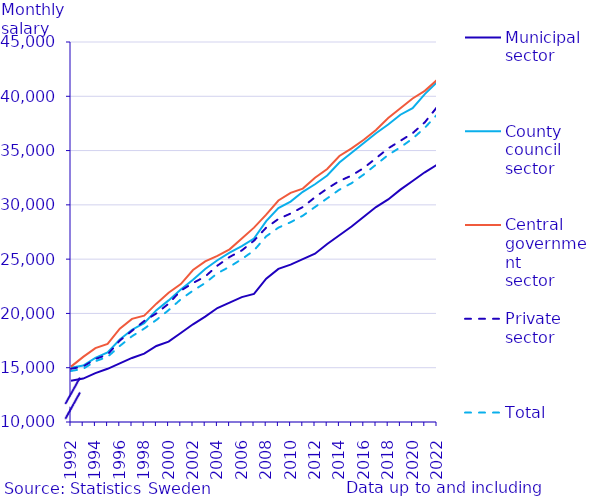
| Category | Municipal
sector | County
council
sector | Central
government
sector | Private
sector | Total |
|---|---|---|---|---|---|
| 1992.0 | 13800 | 15000 | 15100 | 14900 | 14700 |
| 1993.0 | 14000 | 15200 | 16000 | 15100 | 14900 |
| 1994.0 | 14500 | 15900 | 16800 | 15800 | 15600 |
| 1995.0 | 14900 | 16400 | 17200 | 16200 | 16000 |
| 1996.0 | 15400 | 17600 | 18600 | 17500 | 17000 |
| 1997.0 | 15900 | 18500 | 19500 | 18400 | 17900 |
| 1998.0 | 16300 | 19100 | 19800 | 19300 | 18600 |
| 1999.0 | 17000 | 20300 | 20900 | 20000 | 19400 |
| 2000.0 | 17400 | 21200 | 21900 | 20900 | 20300 |
| 2001.0 | 18200 | 22200 | 22700 | 22100 | 21300 |
| 2002.0 | 19000 | 23100 | 24000 | 22800 | 22100 |
| 2003.0 | 19700 | 24100 | 24800 | 23400 | 22800 |
| 2004.0 | 20500 | 24900 | 25300 | 24400 | 23700 |
| 2005.0 | 21000 | 25600 | 25900 | 25200 | 24300 |
| 2006.0 | 21500 | 26200 | 26900 | 25800 | 25000 |
| 2007.0 | 21800 | 26900 | 27900 | 26700 | 25800 |
| 2008.0 | 23200 | 28500 | 29100 | 27900 | 27100 |
| 2009.0 | 24100 | 29700 | 30400 | 28700 | 27900 |
| 2010.0 | 24500 | 30300 | 31100 | 29200 | 28400 |
| 2011.0 | 25000 | 31200 | 31500 | 29800 | 29000 |
| 2012.0 | 25500 | 31900 | 32500 | 30700 | 29800 |
| 2013.0 | 26400 | 32700 | 33300 | 31500 | 30600 |
| 2014.0 | 27200 | 33900 | 34500 | 32200 | 31400 |
| 2015.0 | 28000 | 34800 | 35200 | 32700 | 32000 |
| 2016.0 | 28900 | 35700 | 36000 | 33400 | 32800 |
| 2017.0 | 29800 | 36600 | 36900 | 34300 | 33700 |
| 2018.0 | 30500 | 37400 | 38000 | 35200 | 34600 |
| 2019.0 | 31400 | 38300 | 38900 | 35900 | 35300 |
| 2020.0 | 32200 | 38900 | 39800 | 36600 | 36100 |
| 2021.0 | 33000 | 40200 | 40500 | 37600 | 37100 |
| 2022.0 | 33700 | 41300 | 41500 | 39000 | 38300 |